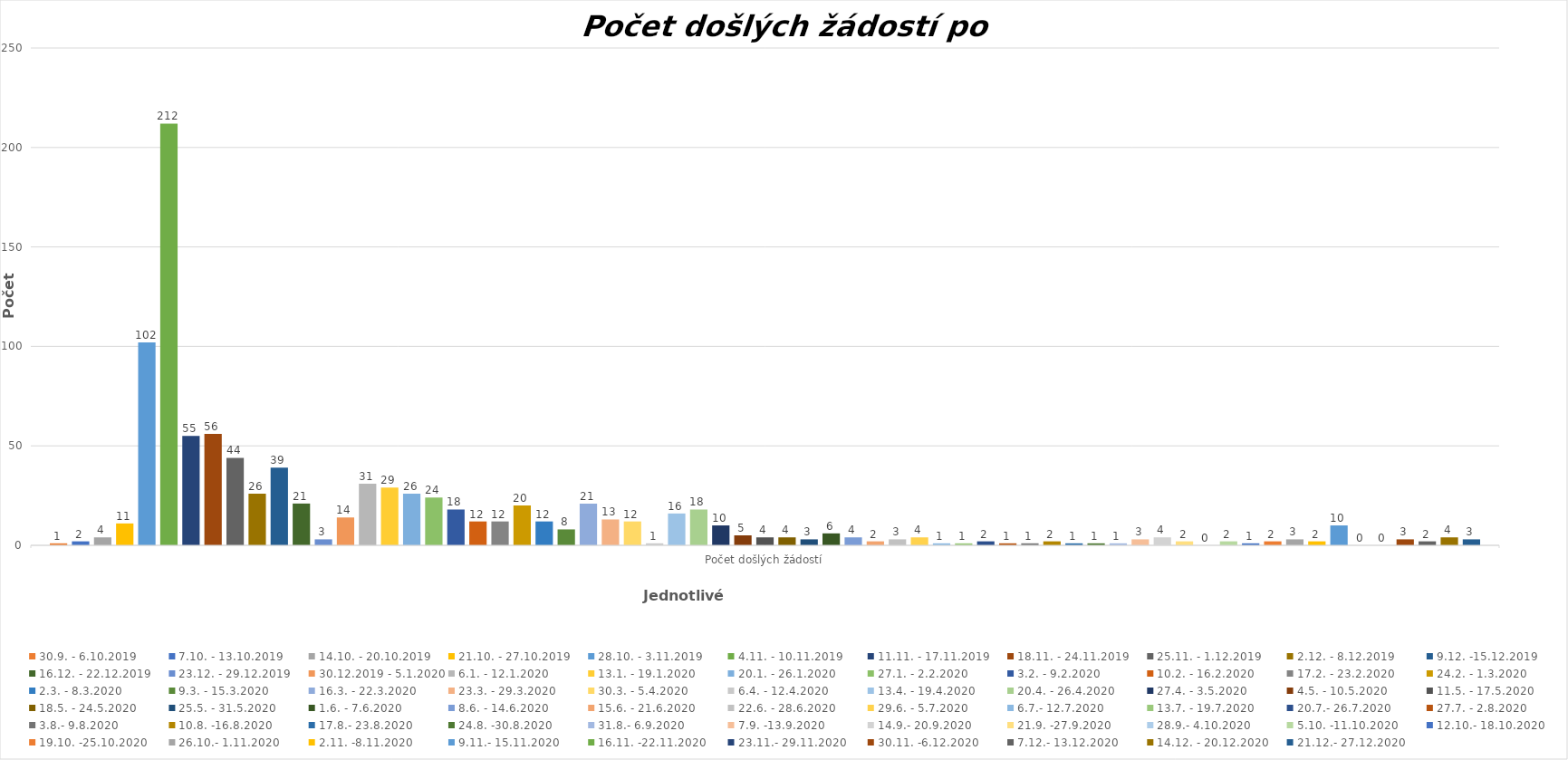
| Category | 30.9. - 6.10.2019 | 7.10. - 13.10.2019 | 14.10. - 20.10.2019 | 21.10. - 27.10.2019 | 28.10. - 3.11.2019 | 4.11. - 10.11.2019 | 11.11. - 17.11.2019 | 18.11. - 24.11.2019 | 25.11. - 1.12.2019 | 2.12. - 8.12.2019 | 9.12. -15.12.2019 | 16.12. - 22.12.2019 | 23.12. - 29.12.2019 | 30.12.2019 - 5.1.2020 | 6.1. - 12.1.2020 | 13.1. - 19.1.2020 | 20.1. - 26.1.2020 | 27.1. - 2.2.2020 | 3.2. - 9.2.2020 | 10.2. - 16.2.2020 | 17.2. - 23.2.2020 | 24.2. - 1.3.2020 | 2.3. - 8.3.2020 | 9.3. - 15.3.2020 | 16.3. - 22.3.2020 | 23.3. - 29.3.2020 | 30.3. - 5.4.2020 | 6.4. - 12.4.2020 | 13.4. - 19.4.2020 | 20.4. - 26.4.2020 | 27.4. - 3.5.2020 | 4.5. - 10.5.2020 | 11.5. - 17.5.2020 | 18.5. - 24.5.2020 | 25.5. - 31.5.2020 | 1.6. - 7.6.2020 | 8.6. - 14.6.2020 | 15.6. - 21.6.2020 | 22.6. - 28.6.2020 | 29.6. - 5.7.2020 | 6.7.- 12.7.2020 | 13.7. - 19.7.2020 | 20.7.- 26.7.2020 | 27.7. - 2.8.2020 | 3.8.- 9.8.2020 | 10.8. -16.8.2020 | 17.8.- 23.8.2020 | 24.8. -30.8.2020 | 31.8.- 6.9.2020 | 7.9. -13.9.2020 | 14.9.- 20.9.2020 | 21.9. -27.9.2020 | 28.9.- 4.10.2020 | 5.10. -11.10.2020 | 12.10.- 18.10.2020 | 19.10. -25.10.2020 | 26.10.- 1.11.2020 | 2.11. -8.11.2020 | 9.11.- 15.11.2020 | 16.11. -22.11.2020 | 23.11.- 29.11.2020 | 30.11. -6.12.2020 | 7.12.- 13.12.2020 | 14.12. - 20.12.2020 | 21.12.- 27.12.2020 |
|---|---|---|---|---|---|---|---|---|---|---|---|---|---|---|---|---|---|---|---|---|---|---|---|---|---|---|---|---|---|---|---|---|---|---|---|---|---|---|---|---|---|---|---|---|---|---|---|---|---|---|---|---|---|---|---|---|---|---|---|---|---|---|---|---|---|
| Počet došlých žádostí | 1 | 2 | 4 | 11 | 102 | 212 | 55 | 56 | 44 | 26 | 39 | 21 | 3 | 14 | 31 | 29 | 26 | 24 | 18 | 12 | 12 | 20 | 12 | 8 | 21 | 13 | 12 | 1 | 16 | 18 | 10 | 5 | 4 | 4 | 3 | 6 | 4 | 2 | 3 | 4 | 1 | 1 | 2 | 1 | 1 | 2 | 1 | 1 | 1 | 3 | 4 | 2 | 0 | 2 | 1 | 2 | 3 | 2 | 10 | 0 | 0 | 3 | 2 | 4 | 3 |